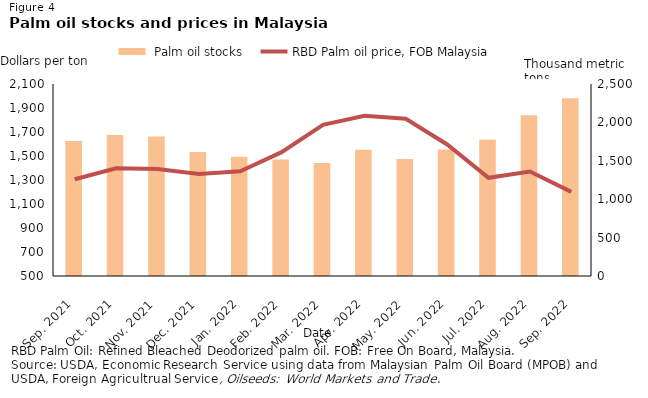
| Category |  Palm oil stocks |
|---|---|
| Sep. 2021 | 1756.404 |
| Oct. 2021 | 1834.568 |
| Nov. 2021 | 1817.061 |
| Dec. 2021 | 1614.594 |
| Jan. 2022 | 1551.151 |
| Feb. 2022 | 1518.238 |
| Mar. 2022 | 1472.843 |
| Apr. 2022 | 1642.813 |
| May. 2022 | 1521.826 |
| Jun. 2022 | 1645.83 |
| Jul. 2022 | 1772.804 |
| Aug. 2022 | 2094.667 |
| Sep. 2022 | 2315.464 |